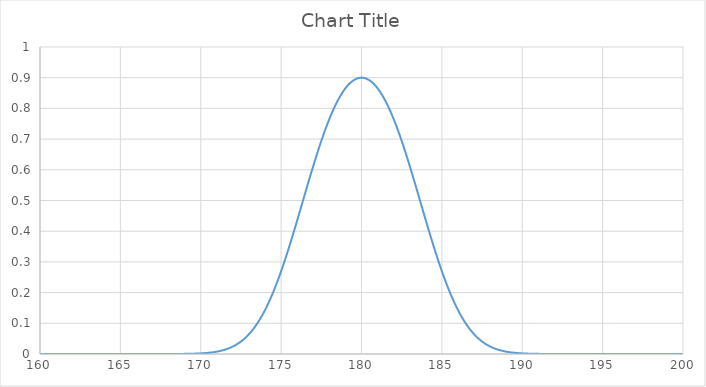
| Category | Series 0 |
|---|---|
| 160.0 | 0 |
| 160.1 | 0 |
| 160.2 | 0 |
| 160.3 | 0 |
| 160.4 | 0 |
| 160.5 | 0 |
| 160.6 | 0 |
| 160.7 | 0 |
| 160.8 | 0 |
| 160.9 | 0 |
| 161.0 | 0 |
| 161.1 | 0 |
| 161.2 | 0 |
| 161.3 | 0 |
| 161.4 | 0 |
| 161.5 | 0 |
| 161.6 | 0 |
| 161.7 | 0 |
| 161.8 | 0 |
| 161.9 | 0 |
| 162.0 | 0 |
| 162.1 | 0 |
| 162.2 | 0 |
| 162.3 | 0 |
| 162.4 | 0 |
| 162.5 | 0 |
| 162.6 | 0 |
| 162.7 | 0 |
| 162.8 | 0 |
| 162.9 | 0 |
| 163.0 | 0 |
| 163.1 | 0 |
| 163.2 | 0 |
| 163.3 | 0 |
| 163.4 | 0 |
| 163.5 | 0 |
| 163.6 | 0 |
| 163.7 | 0 |
| 163.8 | 0 |
| 163.9 | 0 |
| 164.0 | 0 |
| 164.1 | 0 |
| 164.2 | 0 |
| 164.3 | 0 |
| 164.4 | 0 |
| 164.5 | 0 |
| 164.6 | 0 |
| 164.7 | 0 |
| 164.8 | 0 |
| 164.9 | 0 |
| 165.0 | 0 |
| 165.1 | 0 |
| 165.2 | 0 |
| 165.3 | 0 |
| 165.4 | 0 |
| 165.5 | 0 |
| 165.6 | 0 |
| 165.7 | 0 |
| 165.8 | 0 |
| 165.9 | 0 |
| 166.0 | 0 |
| 166.1 | 0 |
| 166.2 | 0 |
| 166.3 | 0 |
| 166.4 | 0 |
| 166.5 | 0 |
| 166.6 | 0 |
| 166.7 | 0 |
| 166.8 | 0 |
| 166.9 | 0 |
| 167.0 | 0 |
| 167.1 | 0 |
| 167.2 | 0 |
| 167.3 | 0 |
| 167.4 | 0 |
| 167.5 | 0 |
| 167.6 | 0 |
| 167.7 | 0 |
| 167.8 | 0 |
| 167.9 | 0 |
| 168.0 | 0 |
| 168.1 | 0 |
| 168.2 | 0 |
| 168.3 | 0 |
| 168.4 | 0 |
| 168.5 | 0 |
| 168.6 | 0 |
| 168.7 | 0 |
| 168.799999999999 | 0 |
| 168.899999999999 | 0 |
| 168.999999999999 | 0 |
| 169.099999999999 | 0.001 |
| 169.199999999999 | 0.001 |
| 169.299999999999 | 0.001 |
| 169.399999999999 | 0.001 |
| 169.499999999999 | 0.001 |
| 169.599999999999 | 0.001 |
| 169.699999999999 | 0.001 |
| 169.799999999999 | 0.002 |
| 169.899999999999 | 0.002 |
| 169.999999999999 | 0.002 |
| 170.099999999999 | 0.002 |
| 170.199999999999 | 0.003 |
| 170.299999999999 | 0.003 |
| 170.399999999999 | 0.004 |
| 170.499999999999 | 0.004 |
| 170.599999999999 | 0.005 |
| 170.699999999999 | 0.005 |
| 170.799999999999 | 0.006 |
| 170.899999999999 | 0.007 |
| 170.999999999999 | 0.008 |
| 171.099999999999 | 0.009 |
| 171.199999999999 | 0.01 |
| 171.299999999999 | 0.011 |
| 171.399999999999 | 0.013 |
| 171.499999999999 | 0.014 |
| 171.599999999999 | 0.016 |
| 171.699999999999 | 0.018 |
| 171.799999999999 | 0.02 |
| 171.899999999999 | 0.022 |
| 171.999999999999 | 0.024 |
| 172.099999999999 | 0.027 |
| 172.199999999999 | 0.03 |
| 172.299999999999 | 0.033 |
| 172.399999999999 | 0.037 |
| 172.499999999999 | 0.041 |
| 172.599999999999 | 0.045 |
| 172.699999999999 | 0.049 |
| 172.799999999999 | 0.054 |
| 172.899999999999 | 0.059 |
| 172.999999999999 | 0.065 |
| 173.099999999999 | 0.07 |
| 173.199999999999 | 0.077 |
| 173.299999999999 | 0.084 |
| 173.399999999999 | 0.091 |
| 173.499999999999 | 0.098 |
| 173.599999999999 | 0.106 |
| 173.699999999999 | 0.115 |
| 173.799999999999 | 0.124 |
| 173.899999999999 | 0.133 |
| 173.999999999999 | 0.143 |
| 174.099999999999 | 0.154 |
| 174.199999999999 | 0.165 |
| 174.299999999999 | 0.176 |
| 174.399999999999 | 0.188 |
| 174.499999999999 | 0.2 |
| 174.599999999999 | 0.213 |
| 174.699999999999 | 0.227 |
| 174.799999999999 | 0.241 |
| 174.899999999999 | 0.255 |
| 174.999999999999 | 0.27 |
| 175.099999999999 | 0.285 |
| 175.199999999999 | 0.3 |
| 175.299999999999 | 0.316 |
| 175.399999999999 | 0.332 |
| 175.499999999999 | 0.349 |
| 175.599999999999 | 0.366 |
| 175.699999999999 | 0.383 |
| 175.799999999999 | 0.4 |
| 175.899999999999 | 0.418 |
| 175.999999999999 | 0.435 |
| 176.099999999999 | 0.453 |
| 176.199999999999 | 0.471 |
| 176.299999999999 | 0.489 |
| 176.399999999999 | 0.507 |
| 176.499999999999 | 0.525 |
| 176.599999999999 | 0.543 |
| 176.699999999999 | 0.56 |
| 176.799999999999 | 0.578 |
| 176.899999999999 | 0.595 |
| 176.999999999999 | 0.613 |
| 177.099999999999 | 0.63 |
| 177.199999999999 | 0.646 |
| 177.299999999999 | 0.663 |
| 177.399999999999 | 0.679 |
| 177.499999999999 | 0.694 |
| 177.599999999999 | 0.709 |
| 177.699999999999 | 0.724 |
| 177.799999999999 | 0.738 |
| 177.899999999999 | 0.752 |
| 177.999999999999 | 0.765 |
| 178.099999999999 | 0.778 |
| 178.199999999999 | 0.79 |
| 178.299999999999 | 0.802 |
| 178.399999999999 | 0.813 |
| 178.499999999999 | 0.823 |
| 178.599999999999 | 0.833 |
| 178.699999999999 | 0.842 |
| 178.799999999999 | 0.851 |
| 178.899999999999 | 0.858 |
| 178.999999999999 | 0.866 |
| 179.099999999999 | 0.872 |
| 179.199999999999 | 0.878 |
| 179.299999999999 | 0.883 |
| 179.399999999999 | 0.888 |
| 179.499999999999 | 0.891 |
| 179.599999999999 | 0.894 |
| 179.699999999999 | 0.897 |
| 179.799999999999 | 0.899 |
| 179.899999999999 | 0.9 |
| 179.999999999999 | 0.9 |
| 180.099999999999 | 0.9 |
| 180.199999999999 | 0.899 |
| 180.299999999999 | 0.897 |
| 180.399999999999 | 0.894 |
| 180.499999999999 | 0.891 |
| 180.599999999999 | 0.888 |
| 180.699999999999 | 0.883 |
| 180.799999999999 | 0.878 |
| 180.899999999999 | 0.872 |
| 180.999999999999 | 0.866 |
| 181.099999999999 | 0.858 |
| 181.199999999999 | 0.851 |
| 181.299999999999 | 0.842 |
| 181.399999999999 | 0.833 |
| 181.499999999999 | 0.823 |
| 181.599999999999 | 0.813 |
| 181.699999999999 | 0.802 |
| 181.799999999999 | 0.79 |
| 181.899999999999 | 0.778 |
| 181.999999999999 | 0.765 |
| 182.099999999999 | 0.752 |
| 182.199999999999 | 0.738 |
| 182.299999999999 | 0.724 |
| 182.399999999999 | 0.709 |
| 182.499999999999 | 0.694 |
| 182.599999999999 | 0.679 |
| 182.699999999999 | 0.663 |
| 182.799999999999 | 0.646 |
| 182.899999999999 | 0.63 |
| 182.999999999999 | 0.613 |
| 183.099999999999 | 0.595 |
| 183.199999999999 | 0.578 |
| 183.299999999999 | 0.56 |
| 183.399999999999 | 0.543 |
| 183.499999999999 | 0.525 |
| 183.599999999999 | 0.507 |
| 183.699999999999 | 0.489 |
| 183.799999999999 | 0.471 |
| 183.899999999999 | 0.453 |
| 183.999999999999 | 0.435 |
| 184.099999999999 | 0.418 |
| 184.199999999999 | 0.4 |
| 184.299999999999 | 0.383 |
| 184.399999999999 | 0.366 |
| 184.499999999999 | 0.349 |
| 184.599999999999 | 0.332 |
| 184.699999999999 | 0.316 |
| 184.799999999999 | 0.3 |
| 184.899999999999 | 0.285 |
| 184.999999999999 | 0.27 |
| 185.099999999999 | 0.255 |
| 185.199999999999 | 0.241 |
| 185.299999999999 | 0.227 |
| 185.399999999999 | 0.213 |
| 185.499999999999 | 0.2 |
| 185.599999999998 | 0.188 |
| 185.699999999999 | 0.176 |
| 185.799999999999 | 0.165 |
| 185.899999999998 | 0.154 |
| 185.999999999998 | 0.143 |
| 186.099999999998 | 0.133 |
| 186.199999999999 | 0.124 |
| 186.299999999999 | 0.115 |
| 186.399999999998 | 0.106 |
| 186.499999999998 | 0.098 |
| 186.599999999998 | 0.091 |
| 186.699999999999 | 0.084 |
| 186.799999999999 | 0.077 |
| 186.899999999998 | 0.07 |
| 186.999999999998 | 0.065 |
| 187.099999999998 | 0.059 |
| 187.199999999999 | 0.054 |
| 187.299999999998 | 0.049 |
| 187.399999999998 | 0.045 |
| 187.499999999998 | 0.041 |
| 187.599999999998 | 0.037 |
| 187.699999999998 | 0.033 |
| 187.799999999998 | 0.03 |
| 187.899999999998 | 0.027 |
| 187.999999999998 | 0.024 |
| 188.099999999998 | 0.022 |
| 188.199999999998 | 0.02 |
| 188.299999999998 | 0.018 |
| 188.399999999998 | 0.016 |
| 188.499999999998 | 0.014 |
| 188.599999999998 | 0.013 |
| 188.699999999998 | 0.011 |
| 188.799999999998 | 0.01 |
| 188.899999999998 | 0.009 |
| 188.999999999998 | 0.008 |
| 189.099999999998 | 0.007 |
| 189.199999999998 | 0.006 |
| 189.299999999998 | 0.005 |
| 189.399999999998 | 0.005 |
| 189.499999999998 | 0.004 |
| 189.599999999998 | 0.004 |
| 189.699999999998 | 0.003 |
| 189.799999999998 | 0.003 |
| 189.899999999998 | 0.002 |
| 189.999999999998 | 0.002 |
| 190.099999999998 | 0.002 |
| 190.199999999998 | 0.002 |
| 190.299999999998 | 0.001 |
| 190.399999999998 | 0.001 |
| 190.499999999998 | 0.001 |
| 190.599999999998 | 0.001 |
| 190.699999999998 | 0.001 |
| 190.799999999998 | 0.001 |
| 190.899999999998 | 0.001 |
| 190.999999999998 | 0 |
| 191.099999999998 | 0 |
| 191.199999999998 | 0 |
| 191.299999999998 | 0 |
| 191.399999999998 | 0 |
| 191.499999999998 | 0 |
| 191.599999999998 | 0 |
| 191.699999999998 | 0 |
| 191.799999999998 | 0 |
| 191.899999999998 | 0 |
| 191.999999999998 | 0 |
| 192.099999999998 | 0 |
| 192.199999999998 | 0 |
| 192.299999999998 | 0 |
| 192.399999999998 | 0 |
| 192.499999999998 | 0 |
| 192.599999999998 | 0 |
| 192.699999999998 | 0 |
| 192.799999999998 | 0 |
| 192.899999999998 | 0 |
| 192.999999999998 | 0 |
| 193.099999999998 | 0 |
| 193.199999999998 | 0 |
| 193.299999999998 | 0 |
| 193.399999999998 | 0 |
| 193.499999999998 | 0 |
| 193.599999999998 | 0 |
| 193.699999999998 | 0 |
| 193.799999999998 | 0 |
| 193.899999999998 | 0 |
| 193.999999999998 | 0 |
| 194.099999999998 | 0 |
| 194.199999999998 | 0 |
| 194.299999999998 | 0 |
| 194.399999999998 | 0 |
| 194.499999999998 | 0 |
| 194.599999999998 | 0 |
| 194.699999999998 | 0 |
| 194.799999999998 | 0 |
| 194.899999999998 | 0 |
| 194.999999999998 | 0 |
| 195.099999999998 | 0 |
| 195.199999999998 | 0 |
| 195.299999999998 | 0 |
| 195.399999999998 | 0 |
| 195.499999999998 | 0 |
| 195.599999999998 | 0 |
| 195.699999999998 | 0 |
| 195.799999999998 | 0 |
| 195.899999999998 | 0 |
| 195.999999999998 | 0 |
| 196.099999999998 | 0 |
| 196.199999999998 | 0 |
| 196.299999999998 | 0 |
| 196.399999999998 | 0 |
| 196.499999999998 | 0 |
| 196.599999999998 | 0 |
| 196.699999999998 | 0 |
| 196.799999999998 | 0 |
| 196.899999999998 | 0 |
| 196.999999999998 | 0 |
| 197.099999999998 | 0 |
| 197.199999999998 | 0 |
| 197.299999999998 | 0 |
| 197.399999999998 | 0 |
| 197.499999999998 | 0 |
| 197.599999999998 | 0 |
| 197.699999999998 | 0 |
| 197.799999999998 | 0 |
| 197.899999999998 | 0 |
| 197.999999999998 | 0 |
| 198.099999999998 | 0 |
| 198.199999999998 | 0 |
| 198.299999999998 | 0 |
| 198.399999999998 | 0 |
| 198.499999999998 | 0 |
| 198.599999999998 | 0 |
| 198.699999999998 | 0 |
| 198.799999999998 | 0 |
| 198.899999999998 | 0 |
| 198.999999999998 | 0 |
| 199.099999999998 | 0 |
| 199.199999999998 | 0 |
| 199.299999999998 | 0 |
| 199.399999999998 | 0 |
| 199.499999999998 | 0 |
| 199.599999999998 | 0 |
| 199.699999999998 | 0 |
| 199.799999999998 | 0 |
| 199.899999999998 | 0 |
| 199.999999999998 | 0 |